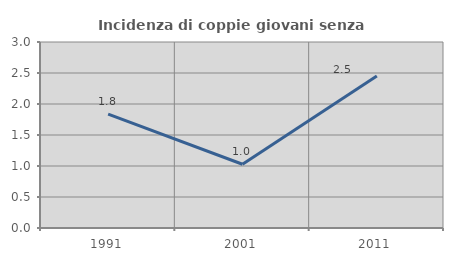
| Category | Incidenza di coppie giovani senza figli |
|---|---|
| 1991.0 | 1.837 |
| 2001.0 | 1.028 |
| 2011.0 | 2.451 |